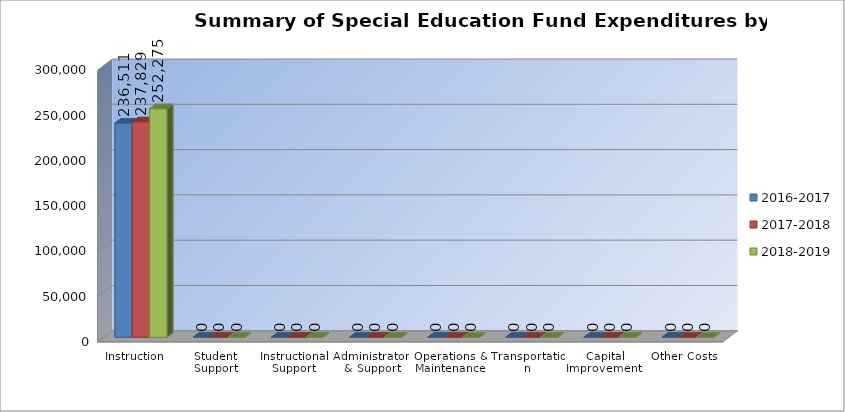
| Category | 2016-2017 | 2017-2018 | 2018-2019 |
|---|---|---|---|
| Instruction | 236511 | 237829 | 252275 |
| Student Support | 0 | 0 | 0 |
| Instructional Support | 0 | 0 | 0 |
| Administraton & Support | 0 | 0 | 0 |
| Operations & Maintenance | 0 | 0 | 0 |
| Transportation | 0 | 0 | 0 |
| Capital Improvements | 0 | 0 | 0 |
| Other Costs | 0 | 0 | 0 |